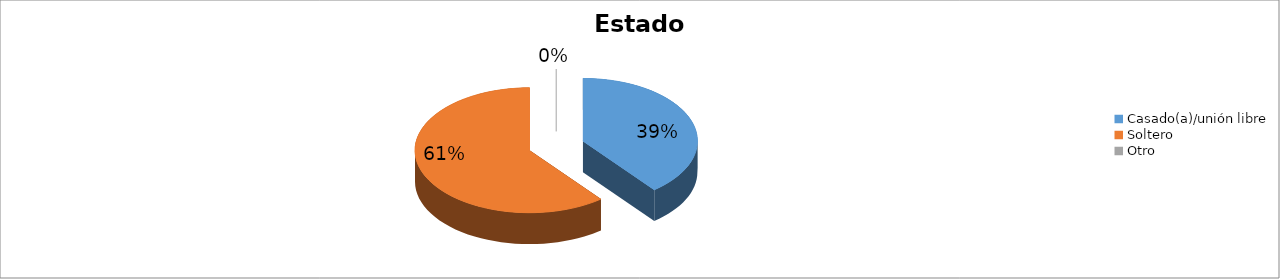
| Category | Series 0 |
|---|---|
| Casado(a)/unión libre | 0.393 |
| Soltero | 0.607 |
| Otro | 0 |